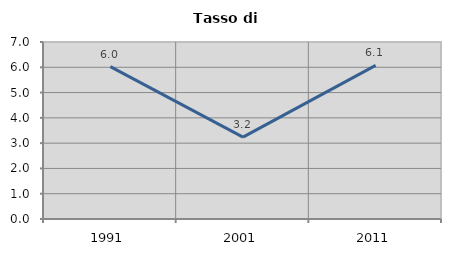
| Category | Tasso di disoccupazione   |
|---|---|
| 1991.0 | 6.025 |
| 2001.0 | 3.237 |
| 2011.0 | 6.078 |